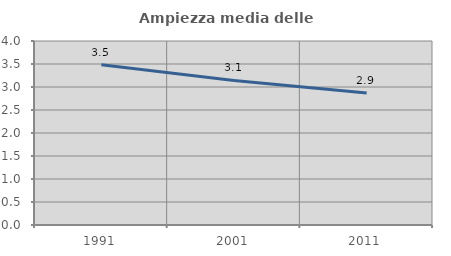
| Category | Ampiezza media delle famiglie |
|---|---|
| 1991.0 | 3.482 |
| 2001.0 | 3.142 |
| 2011.0 | 2.871 |